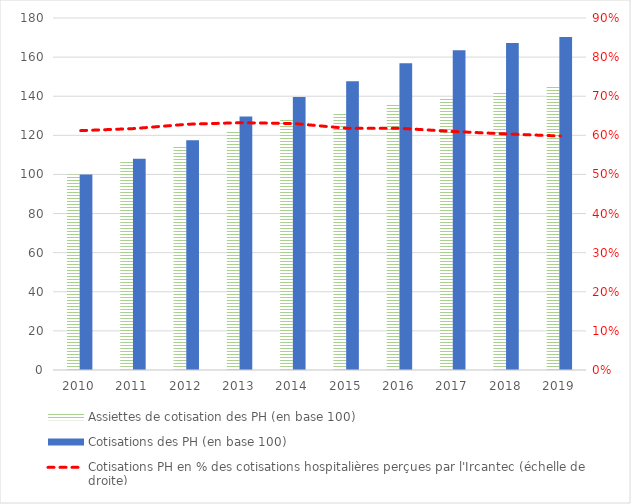
| Category | Assiettes de cotisation des PH (en base 100) | Cotisations des PH (en base 100) |
|---|---|---|
| 2010.0 | 100 | 100 |
| 2011.0 | 106.948 | 108.046 |
| 2012.0 | 114.545 | 117.536 |
| 2013.0 | 122.35 | 129.65 |
| 2014.0 | 128.244 | 139.61 |
| 2015.0 | 131.147 | 147.655 |
| 2016.0 | 136.149 | 156.911 |
| 2017.0 | 139.295 | 163.544 |
| 2018.0 | 142.315 | 167.267 |
| 2019.0 | 145.736 | 170.334 |